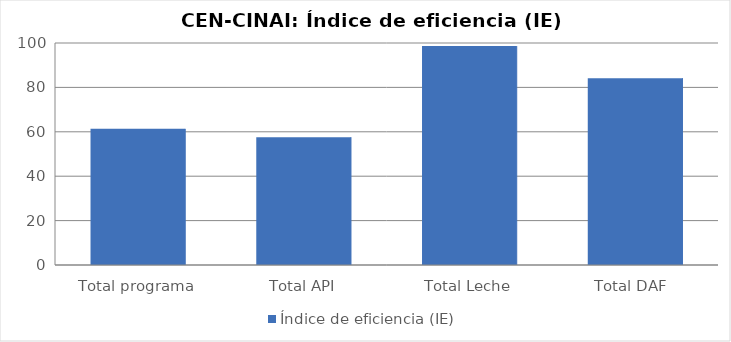
| Category | Índice de eficiencia (IE)  |
|---|---|
| Total programa | 61.321 |
| Total API | 57.583 |
| Total Leche | 98.626 |
| Total DAF  | 84.166 |